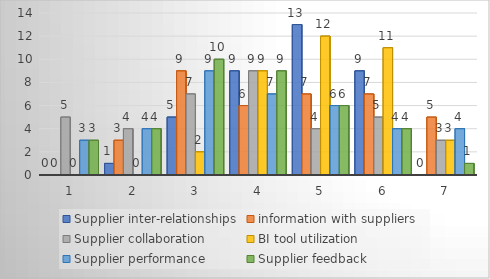
| Category | Supplier inter-relationships | information with suppliers | Supplier collaboration | BI tool utilization | Supplier performance | Supplier feedback |
|---|---|---|---|---|---|---|
| 1.0 | 0 | 0 | 5 | 0 | 3 | 3 |
| 2.0 | 1 | 3 | 4 | 0 | 4 | 4 |
| 3.0 | 5 | 9 | 7 | 2 | 9 | 10 |
| 4.0 | 9 | 6 | 9 | 9 | 7 | 9 |
| 5.0 | 13 | 7 | 4 | 12 | 6 | 6 |
| 6.0 | 9 | 7 | 5 | 11 | 4 | 4 |
| 7.0 | 0 | 5 | 3 | 3 | 4 | 1 |